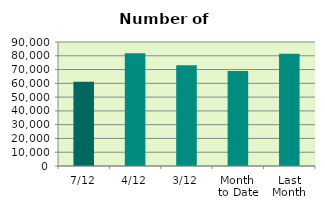
| Category | Series 0 |
|---|---|
| 7/12 | 61144 |
| 4/12 | 81826 |
| 3/12 | 73120 |
| Month 
to Date | 68982.8 |
| Last
Month | 81433.048 |